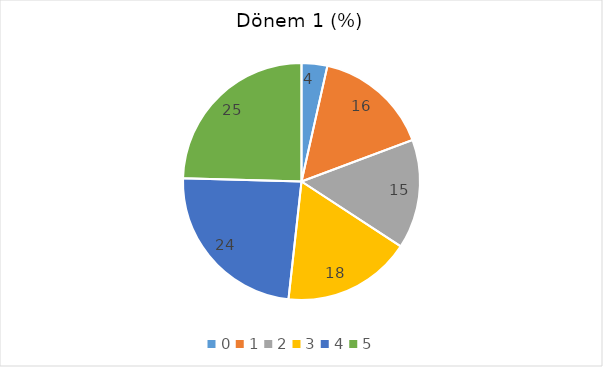
| Category | Dönem 1 (%) |
|---|---|
| 0.0 | 3.509 |
| 1.0 | 15.789 |
| 2.0 | 14.912 |
| 3.0 | 17.544 |
| 4.0 | 23.684 |
| 5.0 | 24.561 |